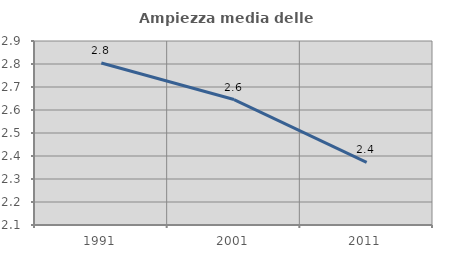
| Category | Ampiezza media delle famiglie |
|---|---|
| 1991.0 | 2.805 |
| 2001.0 | 2.645 |
| 2011.0 | 2.372 |